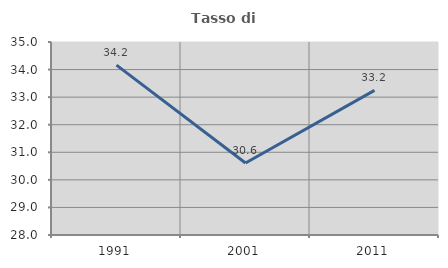
| Category | Tasso di occupazione   |
|---|---|
| 1991.0 | 34.163 |
| 2001.0 | 30.612 |
| 2011.0 | 33.247 |